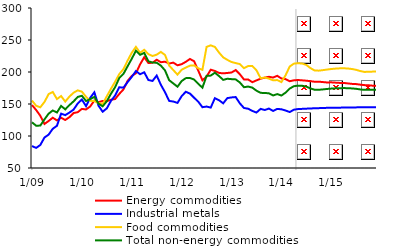
| Category | Energy commodities | Industrial metals | Food commodities | Total non-energy commodities |
|---|---|---|---|---|
|  1/09 | 148.374 | 84.244 | 155.29 | 121.375 |
| 2 | 140.594 | 81.429 | 147.196 | 116.049 |
| 3 | 131.579 | 85.939 | 144.868 | 116.307 |
| 4 | 118.821 | 97.654 | 153.203 | 125.93 |
| 5 | 123.485 | 102.128 | 165.445 | 134.898 |
| 6 | 128.596 | 111.311 | 168.793 | 139.885 |
| 7 | 124.319 | 115.961 | 157.75 | 136.723 |
| 8 | 128.501 | 134.928 | 162.407 | 147.012 |
| 9 | 125.019 | 132.617 | 153.77 | 141.634 |
| 10 | 129.4 | 136.603 | 161.586 | 148.247 |
| 11 | 135.885 | 141.211 | 167.652 | 154.078 |
| 12 | 137.224 | 150.766 | 171.339 | 161.026 |
|  1/10 | 142.36 | 156.985 | 169.298 | 162.848 |
| 2 | 141.454 | 146.691 | 161.28 | 154.731 |
| 3 | 146.139 | 159.641 | 154.948 | 157.505 |
| 4 | 155.503 | 168.291 | 154.706 | 161.124 |
| 5 | 152.815 | 147.383 | 151.358 | 150.602 |
| 6 | 154.773 | 137.917 | 150.12 | 146.431 |
| 7 | 154.404 | 143.15 | 162.09 | 154.366 |
| 8 | 156.6 | 154.951 | 173.778 | 166.045 |
| 9 | 157.731 | 163.172 | 184.769 | 176.337 |
| 10 | 165.78 | 176.163 | 196.798 | 190.619 |
| 11 | 172.845 | 175.509 | 204.537 | 197.056 |
| 12 | 186.117 | 184.213 | 217.756 | 208.974 |
|  1/11 | 193.866 | 192.364 | 230.087 | 220.692 |
| 2 | 197.961 | 201.464 | 239.263 | 233.195 |
| 3 | 211.888 | 196.53 | 230.085 | 226.858 |
| 4 | 223.093 | 199.532 | 234.656 | 229.779 |
| 5 | 213.985 | 187.434 | 227.889 | 216.723 |
| 6 | 214.453 | 186.085 | 224.999 | 214.766 |
| 7 | 219.202 | 194.4 | 227.097 | 214.509 |
| 8 | 215.282 | 180.068 | 231.394 | 209.923 |
| 9 | 216.152 | 168.386 | 226.624 | 202.501 |
| 10 | 213.273 | 154.791 | 210.039 | 187.143 |
| 11 | 214.609 | 153.854 | 203.002 | 182.111 |
| 12 | 210.468 | 151.68 | 195.899 | 177.03 |
|  1/12 | 212.206 | 162.262 | 203.531 | 185.791 |
| 2 | 215.892 | 169.142 | 206.888 | 190.422 |
| 3 | 220.368 | 166.249 | 209.923 | 190.656 |
| 4 | 216.81 | 159.747 | 210.376 | 188.243 |
| 5 | 202.145 | 153.634 | 205.76 | 181.496 |
| 6 | 186.987 | 144.988 | 203.483 | 175.531 |
| 7 | 192.824 | 146.023 | 239.257 | 193.968 |
| 8 | 203.58 | 144.429 | 241.659 | 194.371 |
| 9 | 201.632 | 159.123 | 239.16 | 198.892 |
| 10 | 198.545 | 155.876 | 230.298 | 193.599 |
| 11 | 197.872 | 151.08 | 222.877 | 187.719 |
| 12 | 198.506 | 159.232 | 218.961 | 189.446 |
|  1/13 | 199.211 | 160.268 | 215.635 | 188.838 |
| 2 | 203.006 | 160.884 | 213.914 | 188.464 |
| 3 | 196.5 | 150.989 | 212.418 | 183.66 |
| 4 | 188.283 | 143.751 | 205.957 | 176.229 |
| 5 | 188.363 | 142.633 | 209.217 | 177.291 |
| 6 | 184.08 | 139.203 | 209.43 | 175.584 |
| 7 | 186.894 | 136.655 | 202.636 | 170.834 |
| 8 | 189.545 | 142.363 | 190.269 | 167.446 |
| 9 | 191.167 | 140.665 | 191.401 | 167.195 |
| 10 | 192.506 | 142.846 | 189.669 | 166.752 |
| 11 | 191.356 | 139.179 | 187.003 | 163.357 |
| 12 | 194.049 | 142.293 | 187.396 | 165.509 |
|  1/14 | 189.868 | 141.755 | 184.207 | 163.226 |
| 2 | 188.877 | 139.824 | 194.827 | 167.719 |
| 3 | 185.58 | 137.422 | 208.545 | 174.079 |
| 4 | 187.01 | 141.087 | 213.064 | 177.799 |
| 5 | 187.482 | 142.092 | 213.73 | 178.659 |
| 6 | 186.953 | 142.393 | 213.178 | 178.448 |
| 7 | 186.407 | 142.719 | 211.031 | 177.151 |
| 8 | 185.674 | 143.039 | 206.079 | 174.312 |
| 9 | 184.792 | 143.31 | 202.341 | 172.276 |
| 10 | 184.88 | 143.524 | 202.116 | 172.23 |
| 11 | 184.255 | 143.793 | 202.916 | 172.809 |
| 12 | 183.65 | 144.005 | 203.84 | 173.503 |
|  1/15 | 183.853 | 144.051 | 204.655 | 174.064 |
| 2 | 183.395 | 144.162 | 205.273 | 174.461 |
| 3 | 182.982 | 144.285 | 205.704 | 174.728 |
| 4 | 182.902 | 144.43 | 205.816 | 174.849 |
| 5 | 182.145 | 144.578 | 205.451 | 174.727 |
| 6 | 181.426 | 144.637 | 204.645 | 174.342 |
| 7 | 181.088 | 144.715 | 203.38 | 173.731 |
| 8 | 180.231 | 144.822 | 201.424 | 172.745 |
| 9 | 179.494 | 144.919 | 200.137 | 172.105 |
| 10 | 179.227 | 144.979 | 200.347 | 172.192 |
| 11 | 178.57 | 144.928 | 200.624 | 172.278 |
| 12 | 178.213 | 144.872 | 200.728 | 172.303 |